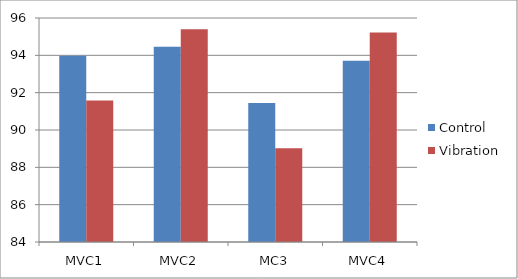
| Category | Control | Vibration |
|---|---|---|
| MVC1 | 93.972 | 91.576 |
| MVC2 | 94.465 | 95.396 |
| MC3 | 91.45 | 89.027 |
| MVC4 | 93.707 | 95.225 |